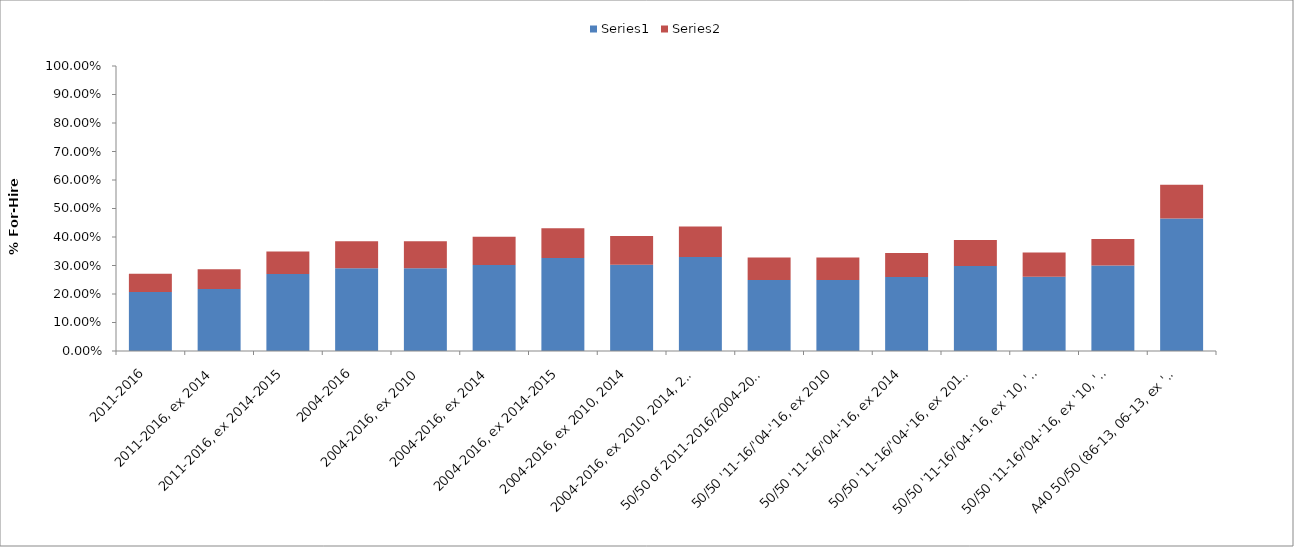
| Category | Series 0 | Series 1 |
|---|---|---|
| 2011-2016 | 0.207 | 0.064 |
| 2011-2016, ex 2014 | 0.217 | 0.07 |
| 2011-2016, ex 2014-2015 | 0.27 | 0.079 |
| 2004-2016 | 0.29 | 0.094 |
| 2004-2016, ex 2010 | 0.29 | 0.095 |
| 2004-2016, ex 2014 | 0.302 | 0.099 |
| 2004-2016, ex 2014-2015 | 0.326 | 0.105 |
| 2004-2016, ex 2010, 2014 | 0.303 | 0.101 |
| 2004-2016, ex 2010, 2014, 2015 | 0.33 | 0.107 |
| 50/50 of 2011-2016/2004-2016 | 0.249 | 0.079 |
| 50/50 '11-16/'04-'16, ex 2010 | 0.249 | 0.079 |
| 50/50 '11-16/'04-'16, ex 2014 | 0.26 | 0.085 |
| 50/50 '11-16/'04-'16, ex 2014-2015 | 0.298 | 0.092 |
| 50/50 '11-16/'04-'16, ex '10, '14 | 0.26 | 0.085 |
| 50/50 '11-16/'04-'16, ex '10, '14, '15 | 0.3 | 0.093 |
| A40 50/50 (86-13, 06-13, ex '10) | 0.465 | 0.118 |